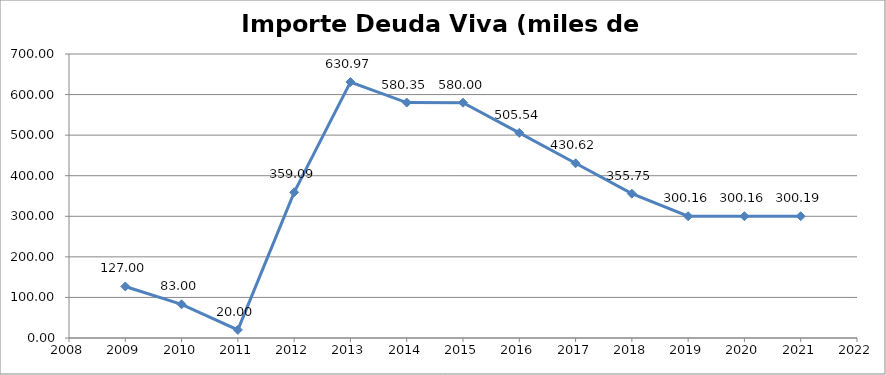
| Category | Importe deuda viva  Miles de €) |
|---|---|
| 2009.0 | 127 |
| 2010.0 | 83 |
| 2011.0 | 20 |
| 2012.0 | 359.092 |
| 2013.0 | 630.968 |
| 2014.0 | 580.347 |
| 2015.0 | 580 |
| 2016.0 | 505.538 |
| 2017.0 | 430.615 |
| 2018.0 | 355.749 |
| 2019.0 | 300.157 |
| 2020.0 | 300.157 |
| 2021.0 | 300.192 |